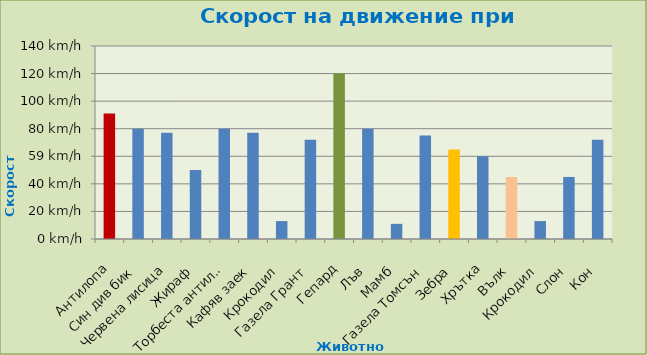
| Category | Ръст |
|---|---|
| Антилопа | 1900-03-31 |
| Син див бик | 1900-03-20 |
| Червена лисица | 1900-03-17 |
| Жираф | 1900-02-19 |
| Торбеста антилопа | 1900-03-20 |
| Кафяв заек | 1900-03-17 |
| Крокодил | 1900-01-13 |
| Газела Грант | 1900-03-12 |
| Гепард | 1900-04-29 |
| Лъв | 1900-03-20 |
| Мамб | 1900-01-11 |
| Газела Томсън | 1900-03-15 |
| Зебра | 1900-03-05 |
| Хрътка | 1900-02-28 |
| Вълк | 1900-02-14 |
| Крокодил | 1900-01-13 |
| Слон | 1900-02-14 |
| Кон | 1900-03-12 |